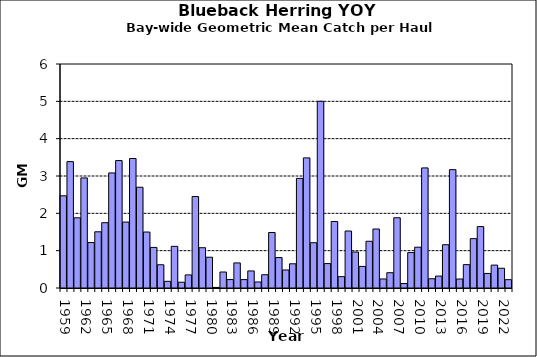
| Category | Series 0 |
|---|---|
| 1959.0 | 2.47 |
| 1960.0 | 3.385 |
| 1961.0 | 1.88 |
| 1962.0 | 2.949 |
| 1963.0 | 1.217 |
| 1964.0 | 1.506 |
| 1965.0 | 1.749 |
| 1966.0 | 3.082 |
| 1967.0 | 3.413 |
| 1968.0 | 1.765 |
| 1969.0 | 3.469 |
| 1970.0 | 2.699 |
| 1971.0 | 1.499 |
| 1972.0 | 1.087 |
| 1973.0 | 0.623 |
| 1974.0 | 0.179 |
| 1975.0 | 1.116 |
| 1976.0 | 0.155 |
| 1977.0 | 0.351 |
| 1978.0 | 2.45 |
| 1979.0 | 1.079 |
| 1980.0 | 0.824 |
| 1981.0 | 0.016 |
| 1982.0 | 0.428 |
| 1983.0 | 0.226 |
| 1984.0 | 0.672 |
| 1985.0 | 0.225 |
| 1986.0 | 0.457 |
| 1987.0 | 0.161 |
| 1988.0 | 0.355 |
| 1989.0 | 1.486 |
| 1990.0 | 0.816 |
| 1991.0 | 0.483 |
| 1992.0 | 0.649 |
| 1993.0 | 2.936 |
| 1994.0 | 3.485 |
| 1995.0 | 1.213 |
| 1996.0 | 5.001 |
| 1997.0 | 0.654 |
| 1998.0 | 1.782 |
| 1999.0 | 0.304 |
| 2000.0 | 1.526 |
| 2001.0 | 0.964 |
| 2002.0 | 0.578 |
| 2003.0 | 1.252 |
| 2004.0 | 1.58 |
| 2005.0 | 0.242 |
| 2006.0 | 0.409 |
| 2007.0 | 1.881 |
| 2008.0 | 0.12 |
| 2009.0 | 0.948 |
| 2010.0 | 1.093 |
| 2011.0 | 3.216 |
| 2012.0 | 0.247 |
| 2013.0 | 0.319 |
| 2014.0 | 1.159 |
| 2015.0 | 3.17 |
| 2016.0 | 0.241 |
| 2017.0 | 0.626 |
| 2018.0 | 1.322 |
| 2019.0 | 1.645 |
| 2020.0 | 0.39 |
| 2021.0 | 0.613 |
| 2022.0 | 0.529 |
| 2023.0 | 0.223 |